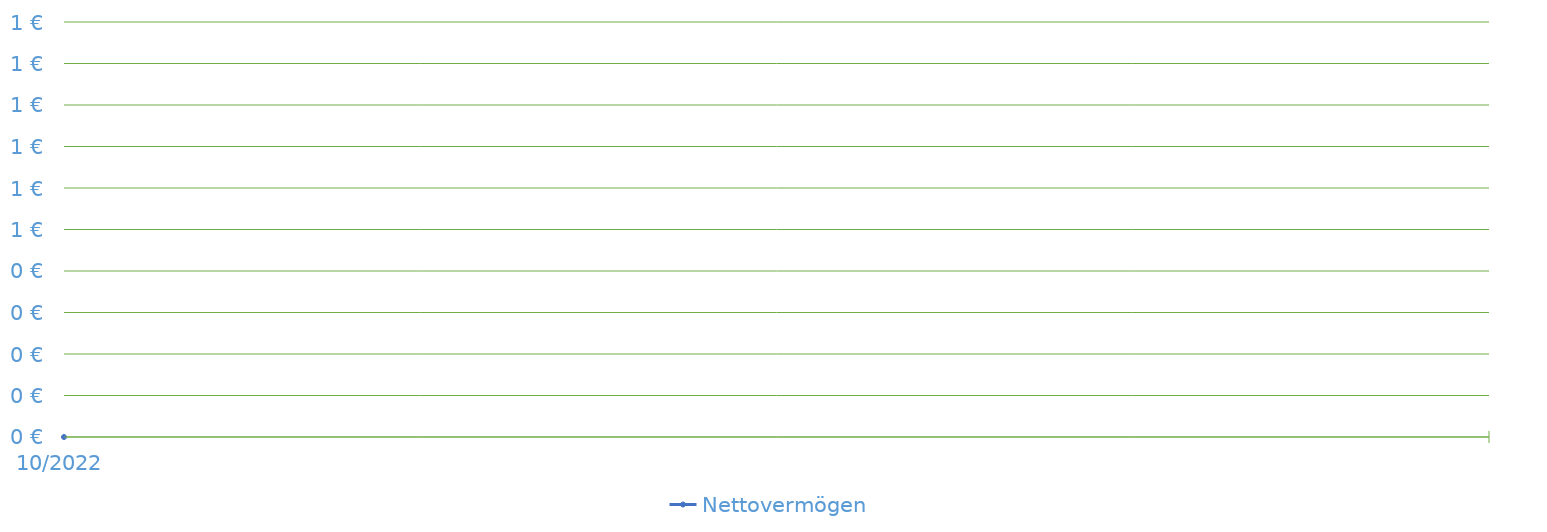
| Category | Nettovermögen |
|---|---|
| 2022-10-25 | 0 |
| nan | 0 |
| nan | 0 |
| nan | 0 |
| nan | 0 |
| nan | 0 |
| nan | 0 |
| nan | 0 |
| nan | 0 |
| nan | 0 |
| nan | 0 |
| nan | 0 |
| nan | 0 |
| nan | 0 |
| nan | 0 |
| nan | 0 |
| nan | 0 |
| nan | 0 |
| nan | 0 |
| nan | 0 |
| nan | 0 |
| nan | 0 |
| nan | 0 |
| nan | 0 |
| nan | 0 |
| nan | 0 |
| nan | 0 |
| nan | 0 |
| nan | 0 |
| nan | 0 |
| nan | 0 |
| nan | 0 |
| nan | 0 |
| nan | 0 |
| nan | 0 |
| nan | 0 |
| nan | 0 |
| nan | 0 |
| nan | 0 |
| nan | 0 |
| nan | 0 |
| nan | 0 |
| nan | 0 |
| nan | 0 |
| nan | 0 |
| nan | 0 |
| nan | 0 |